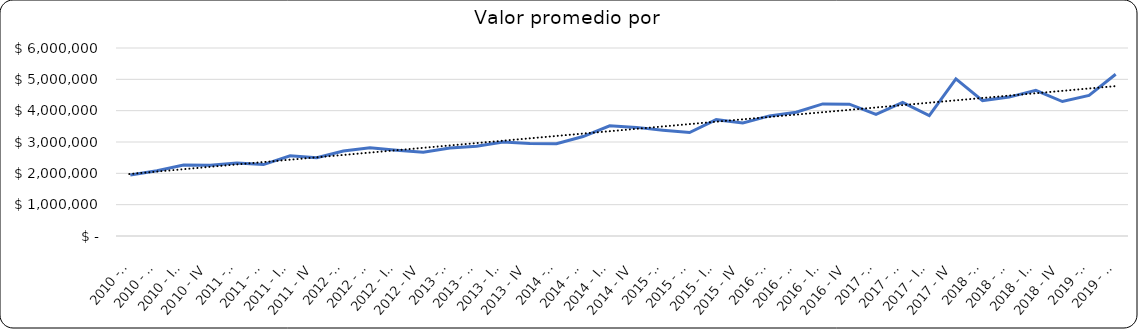
| Category | Valor m2 en Bogotá por sectores |
|---|---|
| 2010 - I | 1946859.903 |
| 2010 - II | 2085346.216 |
| 2010 - III | 2262479.871 |
| 2010 - IV | 2254428.341 |
| 2011 - I | 2326187.925 |
| 2011 - II | 2278911.565 |
| 2011 - III | 2559523.81 |
| 2011 - IV | 2494998.299 |
| 2012 - I | 2710437.71 |
| 2012 - II | 2819865.32 |
| 2012 - III | 2735690.236 |
| 2012 - IV | 2670033.67 |
| 2013 - I | 2805841.924 |
| 2013 - II | 2865979.381 |
| 2013 - III | 3000000 |
| 2013 - IV | 2955326.46 |
| 2014 - I | 2946666.667 |
| 2014 - II | 3173333.333 |
| 2014 - III | 3516666.667 |
| 2014 - IV | 3466666.667 |
| 2015 - I | 3376237.624 |
| 2015 - II | 3300330.033 |
| 2015 - III | 3712871.287 |
| 2015 - IV | 3610561.056 |
| 2016 - I | 3833333.333 |
| 2016 - II | 3948598.131 |
| 2016 - III | 4214743.59 |
| 2016 - IV | 4207920.792 |
| 2017 - I | 3878205.128 |
| 2017 - II | 4264943.457 |
| 2017 - III | 3838995.569 |
| 2017 - IV | 5015105.74 |
| 2018 - I | 4321608.04 |
| 2018 - II | 4432989.691 |
| 2018 - III | 4650000 |
| 2018 - IV | 4292035 |
| 2019 - I | 4485981 |
| 2019 - II | 5162791 |